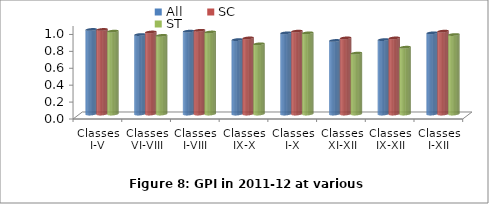
| Category | All | SC | ST |
|---|---|---|---|
| Classes
I-V | 1 | 1 | 0.98 |
| Classes
VI-VIII | 0.94 | 0.97 | 0.93 |
| Classes
I-VIII | 0.98 | 0.99 | 0.97 |
| Classes
IX-X | 0.88 | 0.9 | 0.83 |
| Classes
I-X | 0.96 | 0.98 | 0.96 |
| Classes
XI-XII | 0.87 | 0.9 | 0.72 |
| Classes
IX-XII | 0.88 | 0.9 | 0.79 |
| Classes
I-XII | 0.96 | 0.98 | 0.94 |